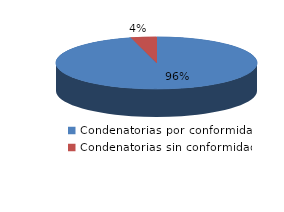
| Category | Series 0 |
|---|---|
| 0 | 467 |
| 1 | 20 |